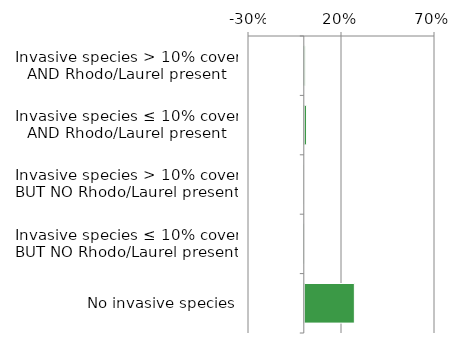
| Category | Non native |
|---|---|
| No invasive species | 0.272 |
| Invasive species ≤ 10% cover BUT NO Rhodo/Laurel present | 0.001 |
| Invasive species > 10% cover BUT NO Rhodo/Laurel present | 0.001 |
| Invasive species ≤ 10% cover AND Rhodo/Laurel present | 0.015 |
| Invasive species > 10% cover AND Rhodo/Laurel present | 0.008 |